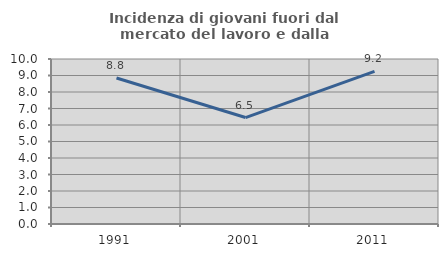
| Category | Incidenza di giovani fuori dal mercato del lavoro e dalla formazione  |
|---|---|
| 1991.0 | 8.846 |
| 2001.0 | 6.452 |
| 2011.0 | 9.249 |